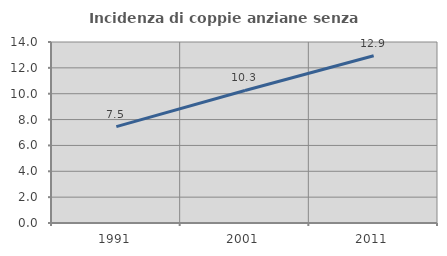
| Category | Incidenza di coppie anziane senza figli  |
|---|---|
| 1991.0 | 7.451 |
| 2001.0 | 10.254 |
| 2011.0 | 12.931 |